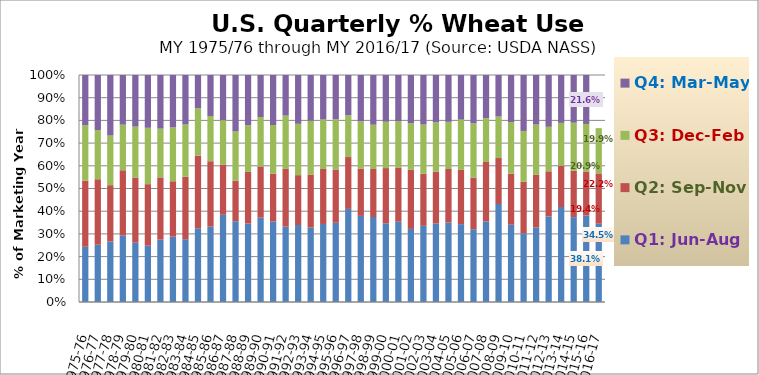
| Category | Q1: Jun-Aug | Q2: Sep-Nov | Q3: Dec-Feb | Q4: Mar-May |
|---|---|---|---|---|
| 1975-76 | 0.243 | 0.291 | 0.244 | 0.221 |
| 1976-77 | 0.252 | 0.288 | 0.217 | 0.242 |
| 1977-78 | 0.266 | 0.249 | 0.218 | 0.267 |
| 1978-79 | 0.292 | 0.288 | 0.201 | 0.219 |
| 1979-80 | 0.261 | 0.287 | 0.224 | 0.227 |
| 1980-81 | 0.248 | 0.271 | 0.248 | 0.233 |
| 1981-82 | 0.275 | 0.274 | 0.214 | 0.236 |
| 1982-83 | 0.288 | 0.244 | 0.237 | 0.231 |
| 1983-84 | 0.277 | 0.275 | 0.23 | 0.218 |
| 1984-85 | 0.325 | 0.32 | 0.209 | 0.147 |
| 1985-86 | 0.332 | 0.288 | 0.199 | 0.181 |
| 1986-87 | 0.384 | 0.222 | 0.195 | 0.199 |
| 1987-88 | 0.356 | 0.179 | 0.216 | 0.249 |
| 1988-89 | 0.346 | 0.227 | 0.205 | 0.221 |
| 1989-90 | 0.371 | 0.226 | 0.218 | 0.185 |
| 1990-91 | 0.355 | 0.211 | 0.214 | 0.22 |
| 1991-92 | 0.332 | 0.254 | 0.235 | 0.179 |
| 1992-93 | 0.339 | 0.22 | 0.226 | 0.215 |
| 1993-94 | 0.328 | 0.234 | 0.237 | 0.201 |
| 1994-95 | 0.344 | 0.242 | 0.218 | 0.196 |
| 1995-96 | 0.349 | 0.235 | 0.221 | 0.195 |
| 1996-97 | 0.41 | 0.229 | 0.184 | 0.177 |
| 1997-98 | 0.379 | 0.209 | 0.207 | 0.204 |
| 1998-99 | 0.374 | 0.212 | 0.195 | 0.219 |
| 1999-00 | 0.347 | 0.243 | 0.204 | 0.206 |
| 2000-01 | 0.354 | 0.239 | 0.205 | 0.203 |
| 2001-02 | 0.322 | 0.261 | 0.205 | 0.213 |
| 2002-03 | 0.336 | 0.23 | 0.216 | 0.218 |
| 2003-04 | 0.345 | 0.228 | 0.218 | 0.209 |
| 2004-05 | 0.35 | 0.236 | 0.208 | 0.206 |
| 2005-06 | 0.343 | 0.239 | 0.222 | 0.197 |
| 2006-07 | 0.321 | 0.228 | 0.239 | 0.213 |
| 2007-08 | 0.355 | 0.262 | 0.193 | 0.19 |
| 2008-09 | 0.432 | 0.203 | 0.183 | 0.183 |
| 2009-10 | 0.34 | 0.225 | 0.227 | 0.208 |
| 2010-11 | 0.302 | 0.228 | 0.224 | 0.246 |
| 2011-12 | 0.328 | 0.232 | 0.222 | 0.218 |
| 2012-13 | 0.377 | 0.199 | 0.196 | 0.228 |
| 2013-14 | 0.418 | 0.182 | 0.189 | 0.211 |
| 2014-15 | 0.374 | 0.204 | 0.211 | 0.21 |
| 2015-16 | 0.381 | 0.194 | 0.209 | 0.216 |
| 2016-17 | 0.345 | 0.222 | 0.199 | 0 |